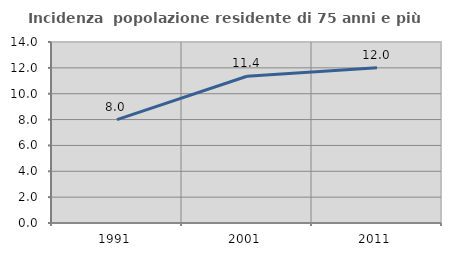
| Category | Incidenza  popolazione residente di 75 anni e più |
|---|---|
| 1991.0 | 7.994 |
| 2001.0 | 11.351 |
| 2011.0 | 12.002 |